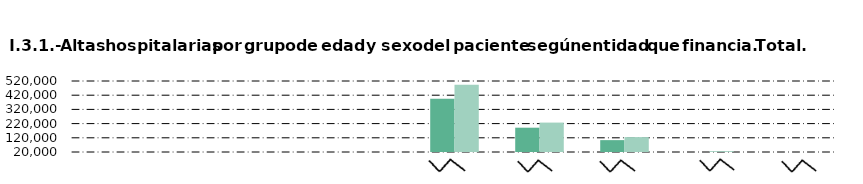
| Category | Hombre | Mujer |
|---|---|---|
| Andalucía | 498 | 286 |
| Castilla y León  | 920 | 1065 |
| Castilla - La Mancha | 1876 | 3013 |
| Extremadura | 414 | 354 |
| Madrid (Comunidad de) | 395087 | 493459 |
| Resto de CC.AA. | 191188 | 227131 |
| Mutualidades y aseguradoras | 103614 | 125201 |
| Particulares | 16559 | 26053 |
| Otros | 13703 | 18748 |